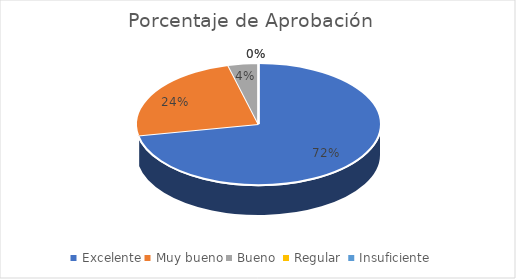
| Category | Porcentaje de Aprobación  |
|---|---|
| Excelente | 0.72 |
| Muy bueno | 0.24 |
| Bueno  | 0.04 |
| Regular  | 0 |
| Insuficiente | 0 |